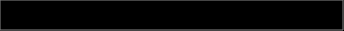
| Category | Series 0 |
|---|---|
| 0 | 0.003 |
| 1 | 0.037 |
| 2 | 0.283 |
| 3 | 0.233 |
| 4 | 0.46 |